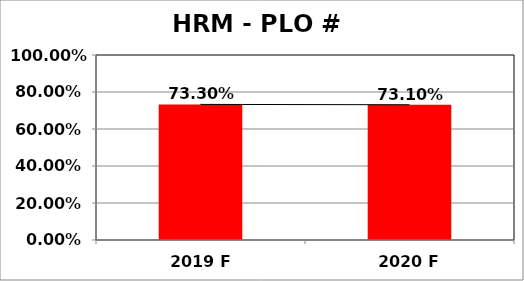
| Category | Series 0 |
|---|---|
| 2019 F | 0.733 |
| 2020 F | 0.731 |